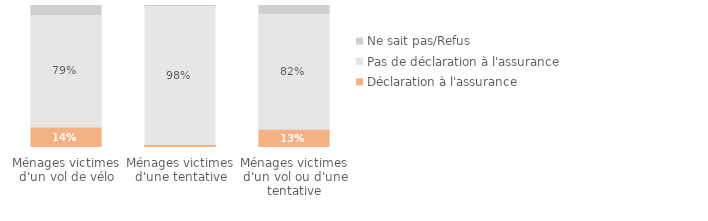
| Category | Déclaration à l'assurance | Pas de déclaration à l'assurance | Ne sait pas/Refus |
|---|---|---|---|
| Ménages victimes d'un vol ou d'une tentative | 0.128 | 0.816 | 0.055 |
| Ménages victimes d'une tentative | 0.021 | 0.979 | 0 |
| Ménages victimes d'un vol de vélo | 0.144 | 0.792 | 0.064 |